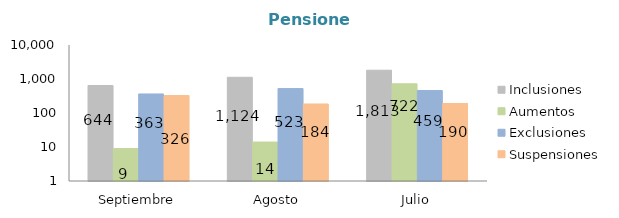
| Category | Inclusiones | Aumentos | Exclusiones | Suspensiones |
|---|---|---|---|---|
| Septiembre | 644 | 9 | 363 | 326 |
| Agosto | 1124 | 14 | 523 | 184 |
| Julio | 1813 | 722 | 459 | 190 |